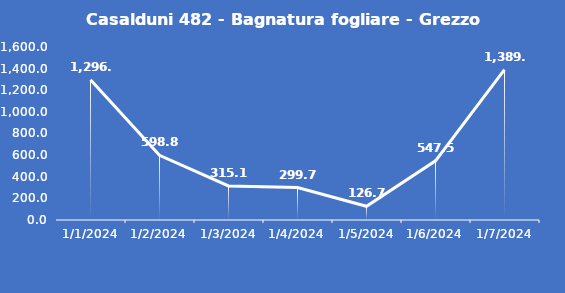
| Category | Casalduni 482 - Bagnatura fogliare - Grezzo (min) |
|---|---|
| 1/1/24 | 1296.7 |
| 1/2/24 | 598.8 |
| 1/3/24 | 315.1 |
| 1/4/24 | 299.7 |
| 1/5/24 | 126.7 |
| 1/6/24 | 547.5 |
| 1/7/24 | 1389.9 |